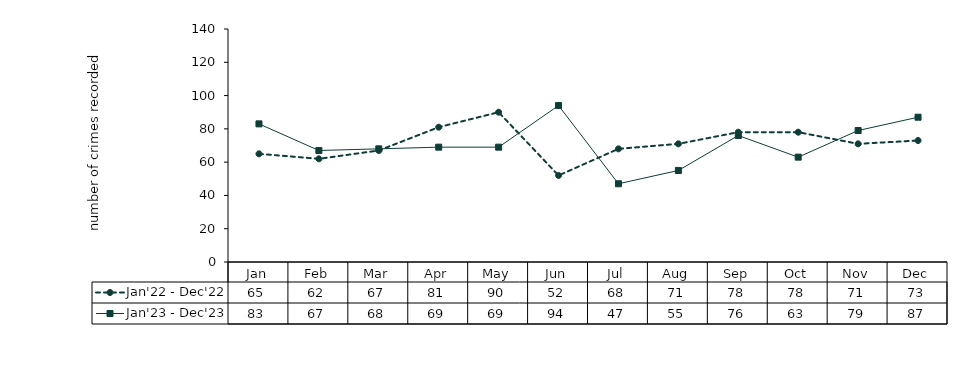
| Category | Jan'22 - Dec'22 | Jan'23 - Dec'23 |
|---|---|---|
| Jan | 65 | 83 |
| Feb | 62 | 67 |
| Mar | 67 | 68 |
| Apr | 81 | 69 |
| May | 90 | 69 |
| Jun | 52 | 94 |
| Jul | 68 | 47 |
| Aug | 71 | 55 |
| Sep | 78 | 76 |
| Oct | 78 | 63 |
| Nov | 71 | 79 |
| Dec | 73 | 87 |